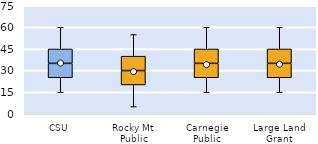
| Category | 25th | 50th | 75th |
|---|---|---|---|
| CSU | 25 | 10 | 10 |
| Rocky Mt Public | 20 | 10 | 10 |
| Carnegie Public | 25 | 10 | 10 |
| Large Land Grant | 25 | 10 | 10 |